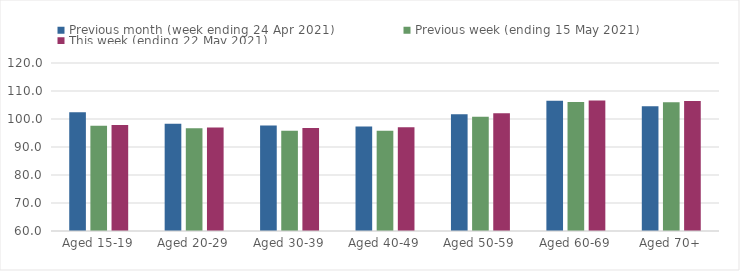
| Category | Previous month (week ending 24 Apr 2021) | Previous week (ending 15 May 2021) | This week (ending 22 May 2021) |
|---|---|---|---|
| Aged 15-19 | 102.45 | 97.63 | 97.88 |
| Aged 20-29 | 98.33 | 96.74 | 96.95 |
| Aged 30-39 | 97.66 | 95.77 | 96.81 |
| Aged 40-49 | 97.33 | 95.82 | 97.03 |
| Aged 50-59 | 101.72 | 100.78 | 102.01 |
| Aged 60-69 | 106.56 | 106.05 | 106.64 |
| Aged 70+ | 104.55 | 105.95 | 106.41 |